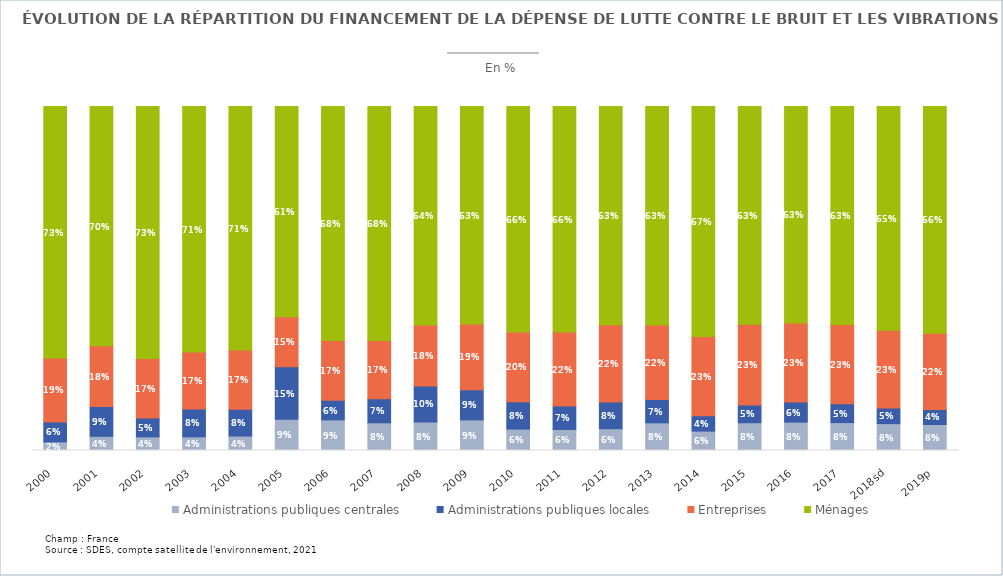
| Category | Administrations publiques centrales | Administrations publiques locales | Entreprises | Ménages |
|---|---|---|---|---|
| 2000 | 0.025 | 0.058 | 0.186 | 0.731 |
| 2001 | 0.041 | 0.087 | 0.177 | 0.696 |
| 2002 | 0.04 | 0.055 | 0.173 | 0.733 |
| 2003 | 0.04 | 0.081 | 0.165 | 0.714 |
| 2004 | 0.042 | 0.078 | 0.173 | 0.708 |
| 2005 | 0.091 | 0.152 | 0.146 | 0.611 |
| 2006 | 0.089 | 0.057 | 0.173 | 0.681 |
| 2007 | 0.08 | 0.07 | 0.169 | 0.681 |
| 2008 | 0.083 | 0.105 | 0.177 | 0.635 |
| 2009 | 0.089 | 0.088 | 0.191 | 0.633 |
| 2010 | 0.062 | 0.079 | 0.203 | 0.656 |
| 2011 | 0.061 | 0.068 | 0.215 | 0.656 |
| 2012 | 0.063 | 0.078 | 0.224 | 0.635 |
| 2013 | 0.08 | 0.068 | 0.217 | 0.635 |
| 2014 | 0.056 | 0.045 | 0.231 | 0.668 |
| 2015 | 0.081 | 0.052 | 0.234 | 0.633 |
| 2016 | 0.082 | 0.059 | 0.229 | 0.63 |
| 2017 | 0.081 | 0.055 | 0.23 | 0.634 |
| 2018sd | 0.078 | 0.045 | 0.226 | 0.65 |
| 2019p | 0.076 | 0.044 | 0.221 | 0.659 |